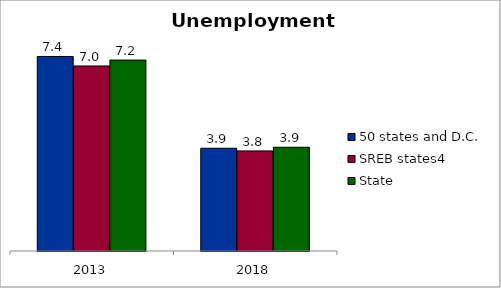
| Category | 50 states and D.C. | SREB states4 | State |
|---|---|---|---|
| 2013.0 | 7.375 | 7.015 | 7.24 |
| 2018.0 | 3.895 | 3.794 | 3.933 |